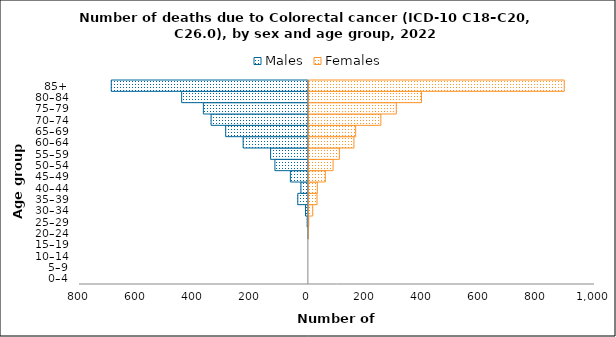
| Category | Males | Females |
|---|---|---|
| 0–4 | 0 | 0 |
| 5–9 | 0 | 0 |
| 10–14 | 0 | 0 |
| 15–19 | 0 | 0 |
| 20–24 | -1 | 1 |
| 25–29 | -4 | 3 |
| 30–34 | -10 | 17 |
| 35–39 | -37 | 32 |
| 40–44 | -26 | 33 |
| 45–49 | -63 | 61 |
| 50–54 | -117 | 88 |
| 55–59 | -132 | 110 |
| 60–64 | -228 | 161 |
| 65–69 | -289 | 167 |
| 70–74 | -340 | 255 |
| 75–79 | -367 | 309 |
| 80–84 | -443 | 397 |
| 85+ | -689 | 896 |